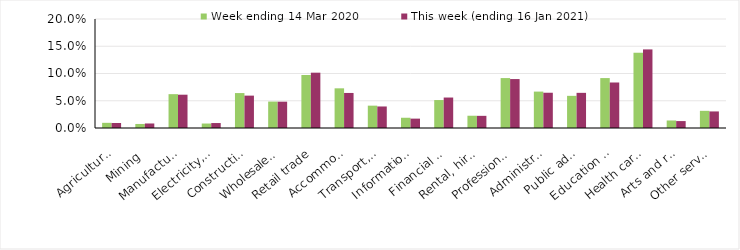
| Category | Week ending 14 Mar 2020 | This week (ending 16 Jan 2021) |
|---|---|---|
| Agriculture, forestry and fishing | 0.01 | 0.009 |
| Mining | 0.007 | 0.008 |
| Manufacturing | 0.062 | 0.061 |
| Electricity, gas, water and waste services | 0.008 | 0.009 |
| Construction | 0.064 | 0.059 |
| Wholesale trade | 0.048 | 0.048 |
| Retail trade | 0.097 | 0.102 |
| Accommodation and food services | 0.073 | 0.064 |
| Transport, postal and warehousing | 0.041 | 0.04 |
| Information media and telecommunications | 0.019 | 0.017 |
| Financial and insurance services | 0.051 | 0.056 |
| Rental, hiring and real estate services | 0.022 | 0.022 |
| Professional, scientific and technical services | 0.092 | 0.09 |
| Administrative and support services | 0.067 | 0.065 |
| Public administration and safety | 0.059 | 0.064 |
| Education and training | 0.092 | 0.084 |
| Health care and social assistance | 0.138 | 0.144 |
| Arts and recreation services | 0.014 | 0.013 |
| Other services | 0.032 | 0.03 |